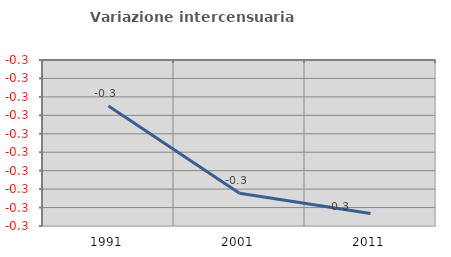
| Category | Variazione intercensuaria annua |
|---|---|
| 1991.0 | -0.303 |
| 2001.0 | -0.312 |
| 2011.0 | -0.315 |